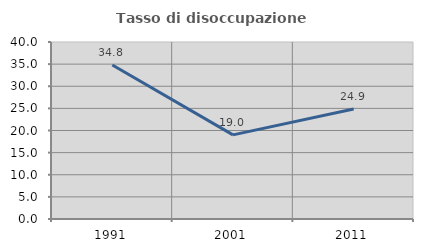
| Category | Tasso di disoccupazione giovanile  |
|---|---|
| 1991.0 | 34.797 |
| 2001.0 | 19.005 |
| 2011.0 | 24.87 |